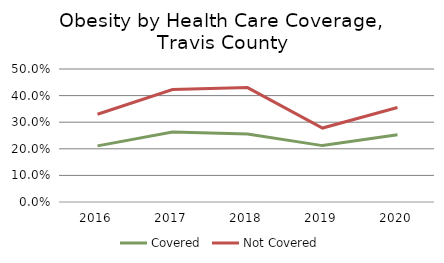
| Category | Covered | Not Covered |
|---|---|---|
| 2016.0 | 0.211 | 0.33 |
| 2017.0 | 0.263 | 0.423 |
| 2018.0 | 0.256 | 0.43 |
| 2019.0 | 0.212 | 0.278 |
| 2020.0 | 0.253 | 0.355 |